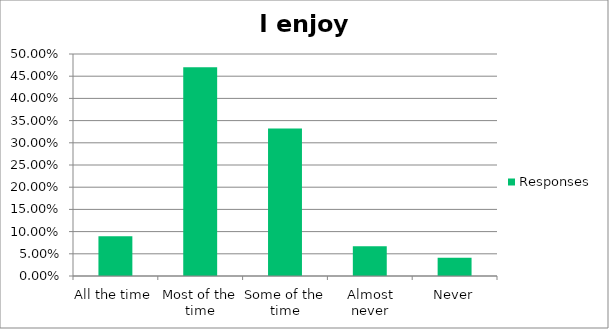
| Category | Responses |
|---|---|
| All the time | 0.09 |
| Most of the time | 0.47 |
| Some of the time | 0.332 |
| Almost never | 0.067 |
| Never | 0.041 |